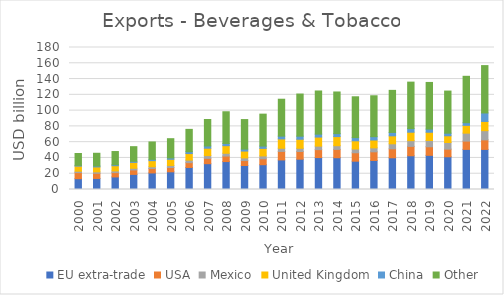
| Category | EU extra-trade | USA | Mexico | United Kingdom | China | Other |
|---|---|---|---|---|---|---|
| 2000.0 | 13689.701 | 7713.288 | 1771.438 | 6483.331 | 930.195 | 15085.419 |
| 2001.0 | 14018.133 | 6540.572 | 1815.073 | 6239.36 | 1130.816 | 16185.811 |
| 2002.0 | 15929.811 | 5535.609 | 2079.647 | 6611.251 | 1219.127 | 16756.852 |
| 2003.0 | 19151.136 | 5651.703 | 2099.636 | 7443.124 | 1393.16 | 18554.968 |
| 2004.0 | 20994.06 | 5607.273 | 2255.045 | 7727.963 | 1613.199 | 22062.427 |
| 2005.0 | 22430.268 | 5401.79 | 2632.251 | 7771.005 | 1771.882 | 24401.887 |
| 2006.0 | 27943.122 | 6086.658 | 3191.338 | 8334.511 | 2318.043 | 28341.972 |
| 2007.0 | 32714.802 | 6764.48 | 3497.767 | 9340.431 | 2813.198 | 33587.983 |
| 2008.0 | 35409.424 | 6957.839 | 3542.828 | 9613.278 | 2853.794 | 40168.899 |
| 2009.0 | 30399.666 | 6307.003 | 3330.598 | 8677.473 | 2463.469 | 37473.793 |
| 2010.0 | 31423.698 | 7505.331 | 3648.039 | 9554.162 | 2869.771 | 40531.159 |
| 2011.0 | 37466.286 | 10797.984 | 4025.837 | 11796.966 | 3539.08 | 46807.601 |
| 2012.0 | 38423.705 | 9777.913 | 4045.38 | 11425.612 | 3941.797 | 53413.752 |
| 2013.0 | 40482.771 | 10061.761 | 4440.879 | 11492.337 | 3691.776 | 54715.354 |
| 2014.0 | 40278.082 | 10547.404 | 4712.944 | 11550.446 | 3694.755 | 52836.258 |
| 2015.0 | 35887.127 | 10679.45 | 4775.989 | 10391.955 | 4026.512 | 51766.081 |
| 2016.0 | 36822.637 | 10949.51 | 5006.892 | 9937.08 | 4232.428 | 51863.141 |
| 2017.0 | 40188.464 | 11397.063 | 6352.636 | 10083.466 | 4299.046 | 53345.417 |
| 2018.0 | 42760.66 | 11893.895 | 7263.528 | 10711.603 | 4496.46 | 58987.185 |
| 2019.0 | 43323.576 | 10860.231 | 7947.497 | 10433.568 | 4008.764 | 59131.361 |
| 2020.0 | 41490.25 | 9664.888 | 8425.359 | 8485.893 | 3321.297 | 53387.622 |
| 2021.0 | 50845.089 | 10522.239 | 10047.697 | 9876.836 | 3393.922 | 58804.746 |
| 2022.0 | 50803.483 | 12099.991 | 11673.717 | 11666.714 | 10776.138 | 60031.525 |